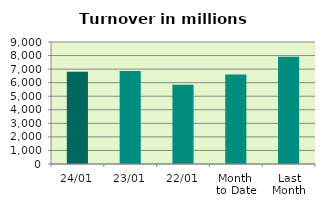
| Category | Series 0 |
|---|---|
| 24/01 | 6807.854 |
| 23/01 | 6867.463 |
| 22/01 | 5842.263 |
| Month 
to Date | 6604.247 |
| Last
Month | 7903.143 |